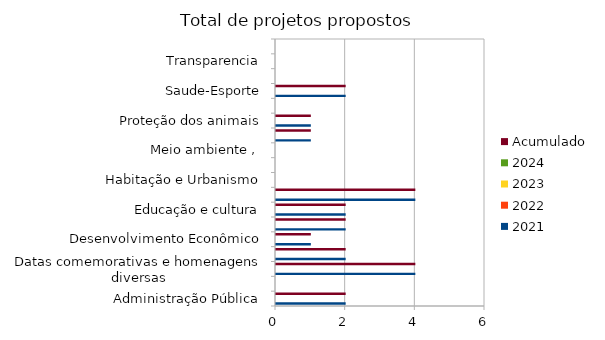
| Category | 2021 | 2022 | 2023 | 2024 | Acumulado |
|---|---|---|---|---|---|
| Administração Pública | 2 |  |  |  | 2 |
| Combate à corrupção  | 0 |  |  |  | 0 |
| Datas comemorativas e homenagens diversas | 4 |  |  |  | 4 |
| Denominação de logradouro | 2 |  |  |  | 2 |
| Desenvolvimento Econômico | 1 |  |  |  | 1 |
| Desenvolvimento Social  | 2 |  |  |  | 2 |
| Educação e cultura | 2 |  |  |  | 2 |
| Frente parlamentar | 4 |  |  |  | 4 |
| Habitação e Urbanismo | 0 |  |  |  | 0 |
| Lei Orgânica do Município | 0 |  |  |  | 0 |
| Meio ambiente ,  | 0 |  |  |  | 0 |
| Mobilidade | 1 |  |  |  | 1 |
| Proteção dos animais | 1 |  |  |  | 1 |
| Regimento Interno da CMSP | 0 |  |  |  | 0 |
| Saude-Esporte | 2 |  |  |  | 2 |
| Segurança Pública | 0 |  |  |  | 0 |
| Transparencia | 0 |  |  |  | 0 |
| Tributação | 0 |  |  |  | 0 |